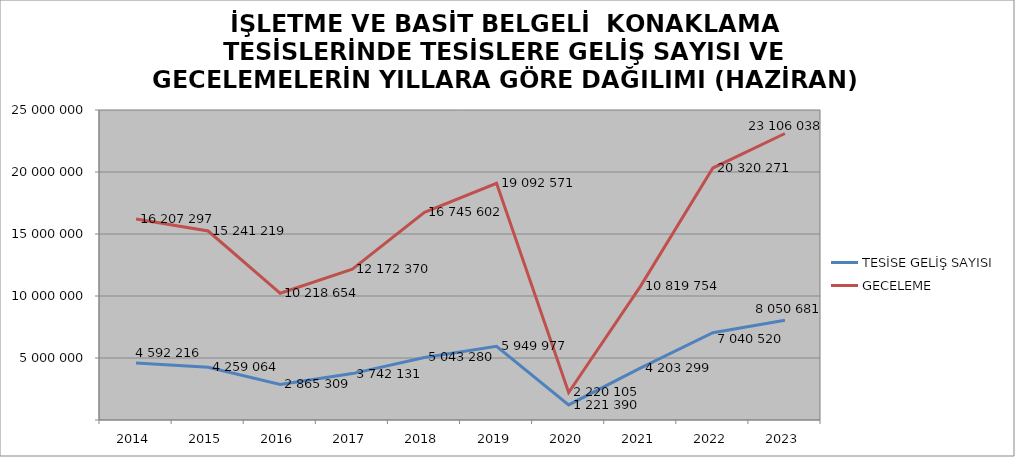
| Category | TESİSE GELİŞ SAYISI | GECELEME |
|---|---|---|
| 2014 | 4592216 | 16207297 |
| 2015 | 4259064 | 15241219 |
| 2016 | 2865309 | 10218654 |
| 2017 | 3742131 | 12172370 |
| 2018 | 5043280 | 16745602 |
| 2019 | 5949977 | 19092571 |
| 2020 | 1221390 | 2220105 |
| 2021 | 4203299 | 10819754 |
| 2022 | 7040520 | 20320271 |
| 2023 | 8050681 | 23106038 |